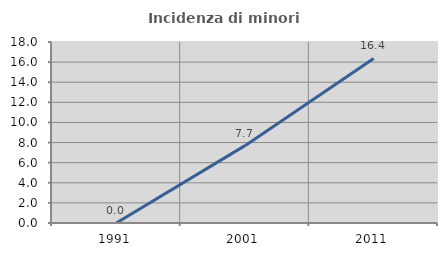
| Category | Incidenza di minori stranieri |
|---|---|
| 1991.0 | 0 |
| 2001.0 | 7.692 |
| 2011.0 | 16.364 |